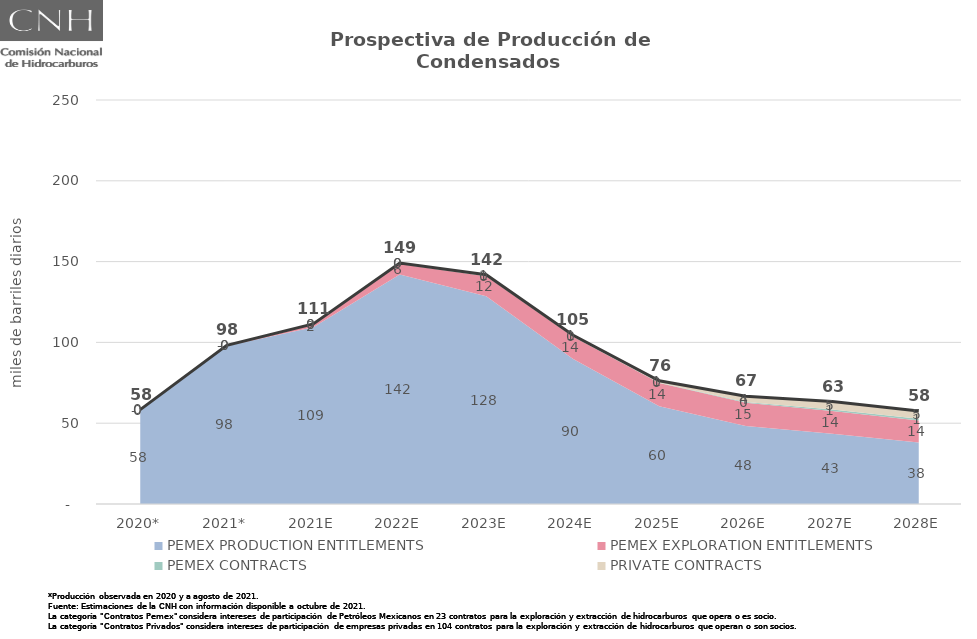
| Category | Total |
|---|---|
| 2020* | 58.422 |
| 2021* | 98.178 |
| 2021E | 111.398 |
| 2022E | 149.117 |
| 2023E | 141.852 |
| 2024E | 104.59 |
| 2025E | 76.217 |
| 2026E | 66.704 |
| 2027E | 63.356 |
| 2028E | 57.555 |